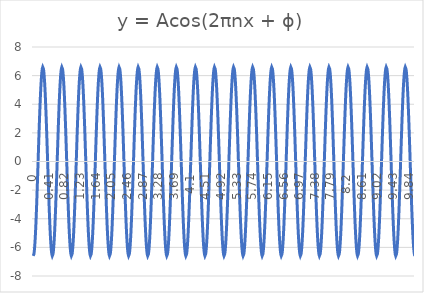
| Category | y = Acos(2πnx + ϕ) |
|---|---|
| 0.0 | -6.594 |
| 0.01 | -6.578 |
| 0.02 | -6.459 |
| 0.03 | -6.238 |
| 0.04 | -5.919 |
| 0.05 | -5.506 |
| 0.060000000000000005 | -5.006 |
| 0.07 | -4.428 |
| 0.08 | -3.779 |
| 0.09 | -3.071 |
| 0.09999999999999999 | -2.315 |
| 0.10999999999999999 | -1.522 |
| 0.11999999999999998 | -0.705 |
| 0.12999999999999998 | 0.123 |
| 0.13999999999999999 | 0.949 |
| 0.15 | 1.76 |
| 0.16 | 2.543 |
| 0.17 | 3.287 |
| 0.18000000000000002 | 3.978 |
| 0.19000000000000003 | 4.607 |
| 0.20000000000000004 | 5.163 |
| 0.21000000000000005 | 5.637 |
| 0.22000000000000006 | 6.023 |
| 0.23000000000000007 | 6.314 |
| 0.24000000000000007 | 6.505 |
| 0.25000000000000006 | 6.594 |
| 0.26000000000000006 | 6.578 |
| 0.2700000000000001 | 6.459 |
| 0.2800000000000001 | 6.238 |
| 0.2900000000000001 | 5.919 |
| 0.3000000000000001 | 5.506 |
| 0.3100000000000001 | 5.006 |
| 0.3200000000000001 | 4.428 |
| 0.3300000000000001 | 3.779 |
| 0.34000000000000014 | 3.071 |
| 0.35000000000000014 | 2.315 |
| 0.36000000000000015 | 1.522 |
| 0.37000000000000016 | 0.705 |
| 0.38000000000000017 | -0.123 |
| 0.3900000000000002 | -0.949 |
| 0.4000000000000002 | -1.76 |
| 0.4100000000000002 | -2.543 |
| 0.4200000000000002 | -3.287 |
| 0.4300000000000002 | -3.978 |
| 0.4400000000000002 | -4.607 |
| 0.45000000000000023 | -5.163 |
| 0.46000000000000024 | -5.637 |
| 0.47000000000000025 | -6.023 |
| 0.48000000000000026 | -6.314 |
| 0.49000000000000027 | -6.505 |
| 0.5000000000000002 | -6.594 |
| 0.5100000000000002 | -6.578 |
| 0.5200000000000002 | -6.459 |
| 0.5300000000000002 | -6.238 |
| 0.5400000000000003 | -5.919 |
| 0.5500000000000003 | -5.506 |
| 0.5600000000000003 | -5.006 |
| 0.5700000000000003 | -4.428 |
| 0.5800000000000003 | -3.779 |
| 0.5900000000000003 | -3.071 |
| 0.6000000000000003 | -2.315 |
| 0.6100000000000003 | -1.522 |
| 0.6200000000000003 | -0.705 |
| 0.6300000000000003 | 0.123 |
| 0.6400000000000003 | 0.949 |
| 0.6500000000000004 | 1.76 |
| 0.6600000000000004 | 2.543 |
| 0.6700000000000004 | 3.287 |
| 0.6800000000000004 | 3.978 |
| 0.6900000000000004 | 4.607 |
| 0.7000000000000004 | 5.163 |
| 0.7100000000000004 | 5.637 |
| 0.7200000000000004 | 6.023 |
| 0.7300000000000004 | 6.314 |
| 0.7400000000000004 | 6.505 |
| 0.7500000000000004 | 6.594 |
| 0.7600000000000005 | 6.578 |
| 0.7700000000000005 | 6.459 |
| 0.7800000000000005 | 6.238 |
| 0.7900000000000005 | 5.919 |
| 0.8000000000000005 | 5.506 |
| 0.8100000000000005 | 5.006 |
| 0.8200000000000005 | 4.428 |
| 0.8300000000000005 | 3.779 |
| 0.8400000000000005 | 3.071 |
| 0.8500000000000005 | 2.315 |
| 0.8600000000000005 | 1.522 |
| 0.8700000000000006 | 0.705 |
| 0.8800000000000006 | -0.123 |
| 0.8900000000000006 | -0.949 |
| 0.9000000000000006 | -1.76 |
| 0.9100000000000006 | -2.543 |
| 0.9200000000000006 | -3.287 |
| 0.9300000000000006 | -3.978 |
| 0.9400000000000006 | -4.607 |
| 0.9500000000000006 | -5.163 |
| 0.9600000000000006 | -5.637 |
| 0.9700000000000006 | -6.023 |
| 0.9800000000000006 | -6.314 |
| 0.9900000000000007 | -6.505 |
| 1.0000000000000007 | -6.594 |
| 1.0100000000000007 | -6.578 |
| 1.0200000000000007 | -6.459 |
| 1.0300000000000007 | -6.238 |
| 1.0400000000000007 | -5.919 |
| 1.0500000000000007 | -5.506 |
| 1.0600000000000007 | -5.006 |
| 1.0700000000000007 | -4.428 |
| 1.0800000000000007 | -3.779 |
| 1.0900000000000007 | -3.071 |
| 1.1000000000000008 | -2.315 |
| 1.1100000000000008 | -1.522 |
| 1.1200000000000008 | -0.705 |
| 1.1300000000000008 | 0.123 |
| 1.1400000000000008 | 0.949 |
| 1.1500000000000008 | 1.76 |
| 1.1600000000000008 | 2.543 |
| 1.1700000000000008 | 3.287 |
| 1.1800000000000008 | 3.978 |
| 1.1900000000000008 | 4.607 |
| 1.2000000000000008 | 5.163 |
| 1.2100000000000009 | 5.637 |
| 1.2200000000000009 | 6.023 |
| 1.2300000000000009 | 6.314 |
| 1.2400000000000009 | 6.505 |
| 1.2500000000000009 | 6.594 |
| 1.260000000000001 | 6.578 |
| 1.270000000000001 | 6.459 |
| 1.280000000000001 | 6.238 |
| 1.290000000000001 | 5.919 |
| 1.300000000000001 | 5.506 |
| 1.310000000000001 | 5.006 |
| 1.320000000000001 | 4.428 |
| 1.330000000000001 | 3.779 |
| 1.340000000000001 | 3.071 |
| 1.350000000000001 | 2.315 |
| 1.360000000000001 | 1.522 |
| 1.370000000000001 | 0.705 |
| 1.380000000000001 | -0.123 |
| 1.390000000000001 | -0.949 |
| 1.400000000000001 | -1.76 |
| 1.410000000000001 | -2.543 |
| 1.420000000000001 | -3.287 |
| 1.430000000000001 | -3.978 |
| 1.440000000000001 | -4.607 |
| 1.450000000000001 | -5.163 |
| 1.460000000000001 | -5.637 |
| 1.470000000000001 | -6.023 |
| 1.480000000000001 | -6.314 |
| 1.490000000000001 | -6.505 |
| 1.500000000000001 | -6.594 |
| 1.5100000000000011 | -6.578 |
| 1.5200000000000011 | -6.459 |
| 1.5300000000000011 | -6.238 |
| 1.5400000000000011 | -5.919 |
| 1.5500000000000012 | -5.506 |
| 1.5600000000000012 | -5.006 |
| 1.5700000000000012 | -4.428 |
| 1.5800000000000012 | -3.779 |
| 1.5900000000000012 | -3.071 |
| 1.6000000000000012 | -2.315 |
| 1.6100000000000012 | -1.522 |
| 1.6200000000000012 | -0.705 |
| 1.6300000000000012 | 0.123 |
| 1.6400000000000012 | 0.949 |
| 1.6500000000000012 | 1.76 |
| 1.6600000000000013 | 2.543 |
| 1.6700000000000013 | 3.287 |
| 1.6800000000000013 | 3.978 |
| 1.6900000000000013 | 4.607 |
| 1.7000000000000013 | 5.163 |
| 1.7100000000000013 | 5.637 |
| 1.7200000000000013 | 6.023 |
| 1.7300000000000013 | 6.314 |
| 1.7400000000000013 | 6.505 |
| 1.7500000000000013 | 6.594 |
| 1.7600000000000013 | 6.578 |
| 1.7700000000000014 | 6.459 |
| 1.7800000000000014 | 6.238 |
| 1.7900000000000014 | 5.919 |
| 1.8000000000000014 | 5.506 |
| 1.8100000000000014 | 5.006 |
| 1.8200000000000014 | 4.428 |
| 1.8300000000000014 | 3.779 |
| 1.8400000000000014 | 3.071 |
| 1.8500000000000014 | 2.315 |
| 1.8600000000000014 | 1.522 |
| 1.8700000000000014 | 0.705 |
| 1.8800000000000014 | -0.123 |
| 1.8900000000000015 | -0.949 |
| 1.9000000000000015 | -1.76 |
| 1.9100000000000015 | -2.543 |
| 1.9200000000000015 | -3.287 |
| 1.9300000000000015 | -3.978 |
| 1.9400000000000015 | -4.607 |
| 1.9500000000000015 | -5.163 |
| 1.9600000000000015 | -5.637 |
| 1.9700000000000015 | -6.023 |
| 1.9800000000000015 | -6.314 |
| 1.9900000000000015 | -6.505 |
| 2.0000000000000013 | -6.594 |
| 2.010000000000001 | -6.578 |
| 2.020000000000001 | -6.459 |
| 2.0300000000000007 | -6.238 |
| 2.0400000000000005 | -5.919 |
| 2.0500000000000003 | -5.506 |
| 2.06 | -5.006 |
| 2.07 | -4.428 |
| 2.0799999999999996 | -3.779 |
| 2.0899999999999994 | -3.071 |
| 2.099999999999999 | -2.315 |
| 2.109999999999999 | -1.522 |
| 2.1199999999999988 | -0.705 |
| 2.1299999999999986 | 0.123 |
| 2.1399999999999983 | 0.949 |
| 2.149999999999998 | 1.76 |
| 2.159999999999998 | 2.543 |
| 2.1699999999999977 | 3.287 |
| 2.1799999999999975 | 3.978 |
| 2.1899999999999973 | 4.607 |
| 2.199999999999997 | 5.163 |
| 2.209999999999997 | 5.637 |
| 2.2199999999999966 | 6.023 |
| 2.2299999999999964 | 6.314 |
| 2.239999999999996 | 6.505 |
| 2.249999999999996 | 6.594 |
| 2.259999999999996 | 6.578 |
| 2.2699999999999956 | 6.459 |
| 2.2799999999999954 | 6.238 |
| 2.289999999999995 | 5.919 |
| 2.299999999999995 | 5.506 |
| 2.3099999999999947 | 5.006 |
| 2.3199999999999945 | 4.428 |
| 2.3299999999999943 | 3.779 |
| 2.339999999999994 | 3.071 |
| 2.349999999999994 | 2.315 |
| 2.3599999999999937 | 1.522 |
| 2.3699999999999934 | 0.705 |
| 2.3799999999999932 | -0.123 |
| 2.389999999999993 | -0.949 |
| 2.399999999999993 | -1.76 |
| 2.4099999999999926 | -2.543 |
| 2.4199999999999924 | -3.287 |
| 2.429999999999992 | -3.978 |
| 2.439999999999992 | -4.607 |
| 2.4499999999999917 | -5.163 |
| 2.4599999999999915 | -5.637 |
| 2.4699999999999913 | -6.023 |
| 2.479999999999991 | -6.314 |
| 2.489999999999991 | -6.505 |
| 2.4999999999999907 | -6.594 |
| 2.5099999999999905 | -6.578 |
| 2.5199999999999902 | -6.459 |
| 2.52999999999999 | -6.238 |
| 2.53999999999999 | -5.919 |
| 2.5499999999999896 | -5.506 |
| 2.5599999999999894 | -5.006 |
| 2.569999999999989 | -4.428 |
| 2.579999999999989 | -3.779 |
| 2.5899999999999888 | -3.071 |
| 2.5999999999999885 | -2.315 |
| 2.6099999999999883 | -1.522 |
| 2.619999999999988 | -0.705 |
| 2.629999999999988 | 0.123 |
| 2.6399999999999877 | 0.949 |
| 2.6499999999999875 | 1.76 |
| 2.6599999999999873 | 2.543 |
| 2.669999999999987 | 3.287 |
| 2.679999999999987 | 3.978 |
| 2.6899999999999866 | 4.607 |
| 2.6999999999999864 | 5.163 |
| 2.709999999999986 | 5.637 |
| 2.719999999999986 | 6.023 |
| 2.7299999999999858 | 6.314 |
| 2.7399999999999856 | 6.505 |
| 2.7499999999999853 | 6.594 |
| 2.759999999999985 | 6.578 |
| 2.769999999999985 | 6.459 |
| 2.7799999999999847 | 6.238 |
| 2.7899999999999845 | 5.919 |
| 2.7999999999999843 | 5.506 |
| 2.809999999999984 | 5.006 |
| 2.819999999999984 | 4.428 |
| 2.8299999999999836 | 3.779 |
| 2.8399999999999834 | 3.071 |
| 2.849999999999983 | 2.315 |
| 2.859999999999983 | 1.522 |
| 2.869999999999983 | 0.705 |
| 2.8799999999999826 | -0.123 |
| 2.8899999999999824 | -0.949 |
| 2.899999999999982 | -1.76 |
| 2.909999999999982 | -2.543 |
| 2.9199999999999817 | -3.287 |
| 2.9299999999999815 | -3.978 |
| 2.9399999999999813 | -4.607 |
| 2.949999999999981 | -5.163 |
| 2.959999999999981 | -5.637 |
| 2.9699999999999807 | -6.023 |
| 2.9799999999999804 | -6.314 |
| 2.9899999999999802 | -6.505 |
| 2.99999999999998 | -6.594 |
| 3.00999999999998 | -6.578 |
| 3.0199999999999796 | -6.459 |
| 3.0299999999999794 | -6.238 |
| 3.039999999999979 | -5.919 |
| 3.049999999999979 | -5.506 |
| 3.0599999999999787 | -5.006 |
| 3.0699999999999785 | -4.428 |
| 3.0799999999999783 | -3.779 |
| 3.089999999999978 | -3.071 |
| 3.099999999999978 | -2.315 |
| 3.1099999999999777 | -1.522 |
| 3.1199999999999775 | -0.705 |
| 3.1299999999999772 | 0.123 |
| 3.139999999999977 | 0.949 |
| 3.149999999999977 | 1.76 |
| 3.1599999999999766 | 2.543 |
| 3.1699999999999764 | 3.287 |
| 3.179999999999976 | 3.978 |
| 3.189999999999976 | 4.607 |
| 3.1999999999999758 | 5.163 |
| 3.2099999999999755 | 5.637 |
| 3.2199999999999753 | 6.023 |
| 3.229999999999975 | 6.314 |
| 3.239999999999975 | 6.505 |
| 3.2499999999999747 | 6.594 |
| 3.2599999999999745 | 6.578 |
| 3.2699999999999743 | 6.459 |
| 3.279999999999974 | 6.238 |
| 3.289999999999974 | 5.919 |
| 3.2999999999999736 | 5.506 |
| 3.3099999999999734 | 5.006 |
| 3.319999999999973 | 4.428 |
| 3.329999999999973 | 3.779 |
| 3.3399999999999728 | 3.071 |
| 3.3499999999999726 | 2.315 |
| 3.3599999999999723 | 1.522 |
| 3.369999999999972 | 0.705 |
| 3.379999999999972 | -0.123 |
| 3.3899999999999717 | -0.949 |
| 3.3999999999999715 | -1.76 |
| 3.4099999999999713 | -2.543 |
| 3.419999999999971 | -3.287 |
| 3.429999999999971 | -3.978 |
| 3.4399999999999706 | -4.607 |
| 3.4499999999999704 | -5.163 |
| 3.45999999999997 | -5.637 |
| 3.46999999999997 | -6.023 |
| 3.47999999999997 | -6.314 |
| 3.4899999999999696 | -6.505 |
| 3.4999999999999694 | -6.594 |
| 3.509999999999969 | -6.578 |
| 3.519999999999969 | -6.459 |
| 3.5299999999999687 | -6.238 |
| 3.5399999999999685 | -5.919 |
| 3.5499999999999683 | -5.506 |
| 3.559999999999968 | -5.006 |
| 3.569999999999968 | -4.428 |
| 3.5799999999999677 | -3.779 |
| 3.5899999999999674 | -3.071 |
| 3.5999999999999672 | -2.315 |
| 3.609999999999967 | -1.522 |
| 3.619999999999967 | -0.705 |
| 3.6299999999999666 | 0.123 |
| 3.6399999999999664 | 0.949 |
| 3.649999999999966 | 1.76 |
| 3.659999999999966 | 2.543 |
| 3.6699999999999657 | 3.287 |
| 3.6799999999999655 | 3.978 |
| 3.6899999999999653 | 4.607 |
| 3.699999999999965 | 5.163 |
| 3.709999999999965 | 5.637 |
| 3.7199999999999647 | 6.023 |
| 3.7299999999999645 | 6.314 |
| 3.7399999999999642 | 6.505 |
| 3.749999999999964 | 6.594 |
| 3.759999999999964 | 6.578 |
| 3.7699999999999636 | 6.459 |
| 3.7799999999999634 | 6.238 |
| 3.789999999999963 | 5.919 |
| 3.799999999999963 | 5.506 |
| 3.8099999999999627 | 5.006 |
| 3.8199999999999625 | 4.428 |
| 3.8299999999999623 | 3.779 |
| 3.839999999999962 | 3.071 |
| 3.849999999999962 | 2.315 |
| 3.8599999999999617 | 1.522 |
| 3.8699999999999615 | 0.705 |
| 3.8799999999999613 | -0.123 |
| 3.889999999999961 | -0.949 |
| 3.899999999999961 | -1.76 |
| 3.9099999999999606 | -2.543 |
| 3.9199999999999604 | -3.287 |
| 3.92999999999996 | -3.978 |
| 3.93999999999996 | -4.607 |
| 3.9499999999999598 | -5.163 |
| 3.9599999999999596 | -5.637 |
| 3.9699999999999593 | -6.023 |
| 3.979999999999959 | -6.314 |
| 3.989999999999959 | -6.505 |
| 3.9999999999999587 | -6.594 |
| 4.009999999999959 | -6.578 |
| 4.019999999999959 | -6.459 |
| 4.0299999999999585 | -6.238 |
| 4.039999999999958 | -5.919 |
| 4.049999999999958 | -5.506 |
| 4.059999999999958 | -5.006 |
| 4.069999999999958 | -4.428 |
| 4.079999999999957 | -3.779 |
| 4.089999999999957 | -3.071 |
| 4.099999999999957 | -2.315 |
| 4.109999999999957 | -1.522 |
| 4.119999999999957 | -0.705 |
| 4.129999999999956 | 0.123 |
| 4.139999999999956 | 0.949 |
| 4.149999999999956 | 1.76 |
| 4.159999999999956 | 2.543 |
| 4.1699999999999555 | 3.287 |
| 4.179999999999955 | 3.978 |
| 4.189999999999955 | 4.607 |
| 4.199999999999955 | 5.163 |
| 4.209999999999955 | 5.637 |
| 4.2199999999999545 | 6.023 |
| 4.229999999999954 | 6.314 |
| 4.239999999999954 | 6.505 |
| 4.249999999999954 | 6.594 |
| 4.259999999999954 | 6.578 |
| 4.269999999999953 | 6.459 |
| 4.279999999999953 | 6.238 |
| 4.289999999999953 | 5.919 |
| 4.299999999999953 | 5.506 |
| 4.3099999999999525 | 5.006 |
| 4.319999999999952 | 4.428 |
| 4.329999999999952 | 3.779 |
| 4.339999999999952 | 3.071 |
| 4.349999999999952 | 2.315 |
| 4.3599999999999515 | 1.522 |
| 4.369999999999951 | 0.705 |
| 4.379999999999951 | -0.123 |
| 4.389999999999951 | -0.949 |
| 4.399999999999951 | -1.76 |
| 4.40999999999995 | -2.543 |
| 4.41999999999995 | -3.287 |
| 4.42999999999995 | -3.978 |
| 4.43999999999995 | -4.607 |
| 4.4499999999999496 | -5.163 |
| 4.459999999999949 | -5.637 |
| 4.469999999999949 | -6.023 |
| 4.479999999999949 | -6.314 |
| 4.489999999999949 | -6.505 |
| 4.4999999999999485 | -6.594 |
| 4.509999999999948 | -6.578 |
| 4.519999999999948 | -6.459 |
| 4.529999999999948 | -6.238 |
| 4.539999999999948 | -5.919 |
| 4.549999999999947 | -5.506 |
| 4.559999999999947 | -5.006 |
| 4.569999999999947 | -4.428 |
| 4.579999999999947 | -3.779 |
| 4.589999999999947 | -3.071 |
| 4.599999999999946 | -2.315 |
| 4.609999999999946 | -1.522 |
| 4.619999999999946 | -0.705 |
| 4.629999999999946 | 0.123 |
| 4.6399999999999455 | 0.949 |
| 4.649999999999945 | 1.76 |
| 4.659999999999945 | 2.543 |
| 4.669999999999945 | 3.287 |
| 4.679999999999945 | 3.978 |
| 4.689999999999944 | 4.607 |
| 4.699999999999944 | 5.163 |
| 4.709999999999944 | 5.637 |
| 4.719999999999944 | 6.023 |
| 4.729999999999944 | 6.314 |
| 4.739999999999943 | 6.505 |
| 4.749999999999943 | 6.594 |
| 4.759999999999943 | 6.578 |
| 4.769999999999943 | 6.459 |
| 4.7799999999999425 | 6.238 |
| 4.789999999999942 | 5.919 |
| 4.799999999999942 | 5.506 |
| 4.809999999999942 | 5.006 |
| 4.819999999999942 | 4.428 |
| 4.8299999999999415 | 3.779 |
| 4.839999999999941 | 3.071 |
| 4.849999999999941 | 2.315 |
| 4.859999999999941 | 1.522 |
| 4.869999999999941 | 0.705 |
| 4.87999999999994 | -0.123 |
| 4.88999999999994 | -0.949 |
| 4.89999999999994 | -1.76 |
| 4.90999999999994 | -2.543 |
| 4.9199999999999395 | -3.287 |
| 4.929999999999939 | -3.978 |
| 4.939999999999939 | -4.607 |
| 4.949999999999939 | -5.163 |
| 4.959999999999939 | -5.637 |
| 4.9699999999999385 | -6.023 |
| 4.979999999999938 | -6.314 |
| 4.989999999999938 | -6.505 |
| 4.999999999999938 | -6.594 |
| 5.009999999999938 | -6.578 |
| 5.019999999999937 | -6.459 |
| 5.029999999999937 | -6.238 |
| 5.039999999999937 | -5.919 |
| 5.049999999999937 | -5.506 |
| 5.0599999999999365 | -5.006 |
| 5.069999999999936 | -4.428 |
| 5.079999999999936 | -3.779 |
| 5.089999999999936 | -3.071 |
| 5.099999999999936 | -2.315 |
| 5.1099999999999355 | -1.522 |
| 5.119999999999935 | -0.705 |
| 5.129999999999935 | 0.123 |
| 5.139999999999935 | 0.949 |
| 5.149999999999935 | 1.76 |
| 5.159999999999934 | 2.543 |
| 5.169999999999934 | 3.287 |
| 5.179999999999934 | 3.978 |
| 5.189999999999934 | 4.607 |
| 5.199999999999934 | 5.163 |
| 5.209999999999933 | 5.637 |
| 5.219999999999933 | 6.023 |
| 5.229999999999933 | 6.314 |
| 5.239999999999933 | 6.505 |
| 5.2499999999999325 | 6.594 |
| 5.259999999999932 | 6.578 |
| 5.269999999999932 | 6.459 |
| 5.279999999999932 | 6.238 |
| 5.289999999999932 | 5.919 |
| 5.299999999999931 | 5.506 |
| 5.309999999999931 | 5.006 |
| 5.319999999999931 | 4.428 |
| 5.329999999999931 | 3.779 |
| 5.339999999999931 | 3.071 |
| 5.34999999999993 | 2.315 |
| 5.35999999999993 | 1.522 |
| 5.36999999999993 | 0.705 |
| 5.37999999999993 | -0.123 |
| 5.3899999999999295 | -0.949 |
| 5.399999999999929 | -1.76 |
| 5.409999999999929 | -2.543 |
| 5.419999999999929 | -3.287 |
| 5.429999999999929 | -3.978 |
| 5.4399999999999284 | -4.607 |
| 5.449999999999928 | -5.163 |
| 5.459999999999928 | -5.637 |
| 5.469999999999928 | -6.023 |
| 5.479999999999928 | -6.314 |
| 5.489999999999927 | -6.505 |
| 5.499999999999927 | -6.594 |
| 5.509999999999927 | -6.578 |
| 5.519999999999927 | -6.459 |
| 5.5299999999999265 | -6.238 |
| 5.539999999999926 | -5.919 |
| 5.549999999999926 | -5.506 |
| 5.559999999999926 | -5.006 |
| 5.569999999999926 | -4.428 |
| 5.5799999999999255 | -3.779 |
| 5.589999999999925 | -3.071 |
| 5.599999999999925 | -2.315 |
| 5.609999999999925 | -1.522 |
| 5.619999999999925 | -0.705 |
| 5.629999999999924 | 0.123 |
| 5.639999999999924 | 0.949 |
| 5.649999999999924 | 1.76 |
| 5.659999999999924 | 2.543 |
| 5.6699999999999235 | 3.287 |
| 5.679999999999923 | 3.978 |
| 5.689999999999923 | 4.607 |
| 5.699999999999923 | 5.163 |
| 5.709999999999923 | 5.637 |
| 5.7199999999999225 | 6.023 |
| 5.729999999999922 | 6.314 |
| 5.739999999999922 | 6.505 |
| 5.749999999999922 | 6.594 |
| 5.759999999999922 | 6.578 |
| 5.769999999999921 | 6.459 |
| 5.779999999999921 | 6.238 |
| 5.789999999999921 | 5.919 |
| 5.799999999999921 | 5.506 |
| 5.809999999999921 | 5.006 |
| 5.81999999999992 | 4.428 |
| 5.82999999999992 | 3.779 |
| 5.83999999999992 | 3.071 |
| 5.84999999999992 | 2.315 |
| 5.8599999999999195 | 1.522 |
| 5.869999999999919 | 0.705 |
| 5.879999999999919 | -0.123 |
| 5.889999999999919 | -0.949 |
| 5.899999999999919 | -1.76 |
| 5.909999999999918 | -2.543 |
| 5.919999999999918 | -3.287 |
| 5.929999999999918 | -3.978 |
| 5.939999999999918 | -4.607 |
| 5.949999999999918 | -5.163 |
| 5.959999999999917 | -5.637 |
| 5.969999999999917 | -6.023 |
| 5.979999999999917 | -6.314 |
| 5.989999999999917 | -6.505 |
| 5.9999999999999165 | -6.594 |
| 6.009999999999916 | -6.578 |
| 6.019999999999916 | -6.459 |
| 6.029999999999916 | -6.238 |
| 6.039999999999916 | -5.919 |
| 6.0499999999999154 | -5.506 |
| 6.059999999999915 | -5.006 |
| 6.069999999999915 | -4.428 |
| 6.079999999999915 | -3.779 |
| 6.089999999999915 | -3.071 |
| 6.099999999999914 | -2.315 |
| 6.109999999999914 | -1.522 |
| 6.119999999999914 | -0.705 |
| 6.129999999999914 | 0.123 |
| 6.1399999999999135 | 0.949 |
| 6.149999999999913 | 1.76 |
| 6.159999999999913 | 2.543 |
| 6.169999999999913 | 3.287 |
| 6.179999999999913 | 3.978 |
| 6.1899999999999125 | 4.607 |
| 6.199999999999912 | 5.163 |
| 6.209999999999912 | 5.637 |
| 6.219999999999912 | 6.023 |
| 6.229999999999912 | 6.314 |
| 6.239999999999911 | 6.505 |
| 6.249999999999911 | 6.594 |
| 6.259999999999911 | 6.578 |
| 6.269999999999911 | 6.459 |
| 6.2799999999999105 | 6.238 |
| 6.28999999999991 | 5.919 |
| 6.29999999999991 | 5.506 |
| 6.30999999999991 | 5.006 |
| 6.31999999999991 | 4.428 |
| 6.3299999999999095 | 3.779 |
| 6.339999999999909 | 3.071 |
| 6.349999999999909 | 2.315 |
| 6.359999999999909 | 1.522 |
| 6.369999999999909 | 0.705 |
| 6.379999999999908 | -0.123 |
| 6.389999999999908 | -0.949 |
| 6.399999999999908 | -1.76 |
| 6.409999999999908 | -2.543 |
| 6.419999999999908 | -3.287 |
| 6.429999999999907 | -3.978 |
| 6.439999999999907 | -4.607 |
| 6.449999999999907 | -5.163 |
| 6.459999999999907 | -5.637 |
| 6.4699999999999065 | -6.023 |
| 6.479999999999906 | -6.314 |
| 6.489999999999906 | -6.505 |
| 6.499999999999906 | -6.594 |
| 6.509999999999906 | -6.578 |
| 6.519999999999905 | -6.459 |
| 6.529999999999905 | -6.238 |
| 6.539999999999905 | -5.919 |
| 6.549999999999905 | -5.506 |
| 6.559999999999905 | -5.006 |
| 6.569999999999904 | -4.428 |
| 6.579999999999904 | -3.779 |
| 6.589999999999904 | -3.071 |
| 6.599999999999904 | -2.315 |
| 6.6099999999999035 | -1.522 |
| 6.619999999999903 | -0.705 |
| 6.629999999999903 | 0.123 |
| 6.639999999999903 | 0.949 |
| 6.649999999999903 | 1.76 |
| 6.659999999999902 | 2.543 |
| 6.669999999999902 | 3.287 |
| 6.679999999999902 | 3.978 |
| 6.689999999999902 | 4.607 |
| 6.699999999999902 | 5.163 |
| 6.709999999999901 | 5.637 |
| 6.719999999999901 | 6.023 |
| 6.729999999999901 | 6.314 |
| 6.739999999999901 | 6.505 |
| 6.7499999999999005 | 6.594 |
| 6.7599999999999 | 6.578 |
| 6.7699999999999 | 6.459 |
| 6.7799999999999 | 6.238 |
| 6.7899999999999 | 5.919 |
| 6.7999999999998995 | 5.506 |
| 6.809999999999899 | 5.006 |
| 6.819999999999899 | 4.428 |
| 6.829999999999899 | 3.779 |
| 6.839999999999899 | 3.071 |
| 6.849999999999898 | 2.315 |
| 6.859999999999898 | 1.522 |
| 6.869999999999898 | 0.705 |
| 6.879999999999898 | -0.123 |
| 6.8899999999998975 | -0.949 |
| 6.899999999999897 | -1.76 |
| 6.909999999999897 | -2.543 |
| 6.919999999999897 | -3.287 |
| 6.929999999999897 | -3.978 |
| 6.9399999999998965 | -4.607 |
| 6.949999999999896 | -5.163 |
| 6.959999999999896 | -5.637 |
| 6.969999999999896 | -6.023 |
| 6.979999999999896 | -6.314 |
| 6.989999999999895 | -6.505 |
| 6.999999999999895 | -6.594 |
| 7.009999999999895 | -6.578 |
| 7.019999999999895 | -6.459 |
| 7.0299999999998946 | -6.238 |
| 7.039999999999894 | -5.919 |
| 7.049999999999894 | -5.506 |
| 7.059999999999894 | -5.006 |
| 7.069999999999894 | -4.428 |
| 7.0799999999998935 | -3.779 |
| 7.089999999999893 | -3.071 |
| 7.099999999999893 | -2.315 |
| 7.109999999999893 | -1.522 |
| 7.119999999999893 | -0.705 |
| 7.129999999999892 | 0.123 |
| 7.139999999999892 | 0.949 |
| 7.149999999999892 | 1.76 |
| 7.159999999999892 | 2.543 |
| 7.169999999999892 | 3.287 |
| 7.179999999999891 | 3.978 |
| 7.189999999999891 | 4.607 |
| 7.199999999999891 | 5.163 |
| 7.209999999999891 | 5.637 |
| 7.2199999999998905 | 6.023 |
| 7.22999999999989 | 6.314 |
| 7.23999999999989 | 6.505 |
| 7.24999999999989 | 6.594 |
| 7.25999999999989 | 6.578 |
| 7.269999999999889 | 6.459 |
| 7.279999999999889 | 6.238 |
| 7.289999999999889 | 5.919 |
| 7.299999999999889 | 5.506 |
| 7.309999999999889 | 5.006 |
| 7.319999999999888 | 4.428 |
| 7.329999999999888 | 3.779 |
| 7.339999999999888 | 3.071 |
| 7.349999999999888 | 2.315 |
| 7.3599999999998875 | 1.522 |
| 7.369999999999887 | 0.705 |
| 7.379999999999887 | -0.123 |
| 7.389999999999887 | -0.949 |
| 7.399999999999887 | -1.76 |
| 7.4099999999998865 | -2.543 |
| 7.419999999999886 | -3.287 |
| 7.429999999999886 | -3.978 |
| 7.439999999999886 | -4.607 |
| 7.449999999999886 | -5.163 |
| 7.459999999999885 | -5.637 |
| 7.469999999999885 | -6.023 |
| 7.479999999999885 | -6.314 |
| 7.489999999999885 | -6.505 |
| 7.4999999999998845 | -6.594 |
| 7.509999999999884 | -6.578 |
| 7.519999999999884 | -6.459 |
| 7.529999999999884 | -6.238 |
| 7.539999999999884 | -5.919 |
| 7.5499999999998835 | -5.506 |
| 7.559999999999883 | -5.006 |
| 7.569999999999883 | -4.428 |
| 7.579999999999883 | -3.779 |
| 7.589999999999883 | -3.071 |
| 7.599999999999882 | -2.315 |
| 7.609999999999882 | -1.522 |
| 7.619999999999882 | -0.705 |
| 7.629999999999882 | 0.123 |
| 7.6399999999998816 | 0.949 |
| 7.649999999999881 | 1.76 |
| 7.659999999999881 | 2.543 |
| 7.669999999999881 | 3.287 |
| 7.679999999999881 | 3.978 |
| 7.6899999999998805 | 4.607 |
| 7.69999999999988 | 5.163 |
| 7.70999999999988 | 5.637 |
| 7.71999999999988 | 6.023 |
| 7.72999999999988 | 6.314 |
| 7.739999999999879 | 6.505 |
| 7.749999999999879 | 6.594 |
| 7.759999999999879 | 6.578 |
| 7.769999999999879 | 6.459 |
| 7.779999999999879 | 6.238 |
| 7.789999999999878 | 5.919 |
| 7.799999999999878 | 5.506 |
| 7.809999999999878 | 5.006 |
| 7.819999999999878 | 4.428 |
| 7.8299999999998775 | 3.779 |
| 7.839999999999877 | 3.071 |
| 7.849999999999877 | 2.315 |
| 7.859999999999877 | 1.522 |
| 7.869999999999877 | 0.705 |
| 7.879999999999876 | -0.123 |
| 7.889999999999876 | -0.949 |
| 7.899999999999876 | -1.76 |
| 7.909999999999876 | -2.543 |
| 7.919999999999876 | -3.287 |
| 7.929999999999875 | -3.978 |
| 7.939999999999875 | -4.607 |
| 7.949999999999875 | -5.163 |
| 7.959999999999875 | -5.637 |
| 7.9699999999998745 | -6.023 |
| 7.979999999999874 | -6.314 |
| 7.989999999999874 | -6.505 |
| 7.999999999999874 | -6.594 |
| 8.009999999999874 | -6.578 |
| 8.019999999999873 | -6.459 |
| 8.029999999999873 | -6.238 |
| 8.039999999999873 | -5.919 |
| 8.049999999999873 | -5.506 |
| 8.059999999999873 | -5.006 |
| 8.069999999999872 | -4.428 |
| 8.079999999999872 | -3.779 |
| 8.089999999999872 | -3.071 |
| 8.099999999999872 | -2.315 |
| 8.109999999999872 | -1.522 |
| 8.119999999999871 | -0.705 |
| 8.129999999999871 | 0.123 |
| 8.139999999999871 | 0.949 |
| 8.14999999999987 | 1.76 |
| 8.15999999999987 | 2.543 |
| 8.16999999999987 | 3.287 |
| 8.17999999999987 | 3.978 |
| 8.18999999999987 | 4.607 |
| 8.19999999999987 | 5.163 |
| 8.20999999999987 | 5.637 |
| 8.21999999999987 | 6.023 |
| 8.229999999999869 | 6.314 |
| 8.239999999999869 | 6.505 |
| 8.249999999999869 | 6.594 |
| 8.259999999999868 | 6.578 |
| 8.269999999999868 | 6.459 |
| 8.279999999999868 | 6.238 |
| 8.289999999999868 | 5.919 |
| 8.299999999999867 | 5.506 |
| 8.309999999999867 | 5.006 |
| 8.319999999999867 | 4.428 |
| 8.329999999999867 | 3.779 |
| 8.339999999999867 | 3.071 |
| 8.349999999999866 | 2.315 |
| 8.359999999999866 | 1.522 |
| 8.369999999999866 | 0.705 |
| 8.379999999999866 | -0.123 |
| 8.389999999999866 | -0.949 |
| 8.399999999999865 | -1.76 |
| 8.409999999999865 | -2.543 |
| 8.419999999999865 | -3.287 |
| 8.429999999999865 | -3.978 |
| 8.439999999999864 | -4.607 |
| 8.449999999999864 | -5.163 |
| 8.459999999999864 | -5.637 |
| 8.469999999999864 | -6.023 |
| 8.479999999999864 | -6.314 |
| 8.489999999999863 | -6.505 |
| 8.499999999999863 | -6.594 |
| 8.509999999999863 | -6.578 |
| 8.519999999999863 | -6.459 |
| 8.529999999999863 | -6.238 |
| 8.539999999999862 | -5.919 |
| 8.549999999999862 | -5.506 |
| 8.559999999999862 | -5.006 |
| 8.569999999999862 | -4.428 |
| 8.579999999999862 | -3.779 |
| 8.589999999999861 | -3.071 |
| 8.599999999999861 | -2.315 |
| 8.60999999999986 | -1.522 |
| 8.61999999999986 | -0.705 |
| 8.62999999999986 | 0.123 |
| 8.63999999999986 | 0.949 |
| 8.64999999999986 | 1.76 |
| 8.65999999999986 | 2.543 |
| 8.66999999999986 | 3.287 |
| 8.67999999999986 | 3.978 |
| 8.68999999999986 | 4.607 |
| 8.699999999999859 | 5.163 |
| 8.709999999999859 | 5.637 |
| 8.719999999999859 | 6.023 |
| 8.729999999999858 | 6.314 |
| 8.739999999999858 | 6.505 |
| 8.749999999999858 | 6.594 |
| 8.759999999999858 | 6.578 |
| 8.769999999999857 | 6.459 |
| 8.779999999999857 | 6.238 |
| 8.789999999999857 | 5.919 |
| 8.799999999999857 | 5.506 |
| 8.809999999999857 | 5.006 |
| 8.819999999999856 | 4.428 |
| 8.829999999999856 | 3.779 |
| 8.839999999999856 | 3.071 |
| 8.849999999999856 | 2.315 |
| 8.859999999999856 | 1.522 |
| 8.869999999999855 | 0.705 |
| 8.879999999999855 | -0.123 |
| 8.889999999999855 | -0.949 |
| 8.899999999999855 | -1.76 |
| 8.909999999999854 | -2.543 |
| 8.919999999999854 | -3.287 |
| 8.929999999999854 | -3.978 |
| 8.939999999999854 | -4.607 |
| 8.949999999999854 | -5.163 |
| 8.959999999999853 | -5.637 |
| 8.969999999999853 | -6.023 |
| 8.979999999999853 | -6.314 |
| 8.989999999999853 | -6.505 |
| 8.999999999999853 | -6.594 |
| 9.009999999999852 | -6.578 |
| 9.019999999999852 | -6.459 |
| 9.029999999999852 | -6.238 |
| 9.039999999999852 | -5.919 |
| 9.049999999999851 | -5.506 |
| 9.059999999999851 | -5.006 |
| 9.069999999999851 | -4.428 |
| 9.07999999999985 | -3.779 |
| 9.08999999999985 | -3.071 |
| 9.09999999999985 | -2.315 |
| 9.10999999999985 | -1.522 |
| 9.11999999999985 | -0.705 |
| 9.12999999999985 | 0.123 |
| 9.13999999999985 | 0.949 |
| 9.14999999999985 | 1.76 |
| 9.15999999999985 | 2.543 |
| 9.169999999999849 | 3.287 |
| 9.179999999999849 | 3.978 |
| 9.189999999999849 | 4.607 |
| 9.199999999999848 | 5.163 |
| 9.209999999999848 | 5.637 |
| 9.219999999999848 | 6.023 |
| 9.229999999999848 | 6.314 |
| 9.239999999999847 | 6.505 |
| 9.249999999999847 | 6.594 |
| 9.259999999999847 | 6.578 |
| 9.269999999999847 | 6.459 |
| 9.279999999999847 | 6.238 |
| 9.289999999999846 | 5.919 |
| 9.299999999999846 | 5.506 |
| 9.309999999999846 | 5.006 |
| 9.319999999999846 | 4.428 |
| 9.329999999999846 | 3.779 |
| 9.339999999999845 | 3.071 |
| 9.349999999999845 | 2.315 |
| 9.359999999999845 | 1.522 |
| 9.369999999999845 | 0.705 |
| 9.379999999999844 | -0.123 |
| 9.389999999999844 | -0.949 |
| 9.399999999999844 | -1.76 |
| 9.409999999999844 | -2.543 |
| 9.419999999999844 | -3.287 |
| 9.429999999999843 | -3.978 |
| 9.439999999999843 | -4.607 |
| 9.449999999999843 | -5.163 |
| 9.459999999999843 | -5.637 |
| 9.469999999999843 | -6.023 |
| 9.479999999999842 | -6.314 |
| 9.489999999999842 | -6.505 |
| 9.499999999999842 | -6.594 |
| 9.509999999999842 | -6.578 |
| 9.519999999999841 | -6.459 |
| 9.529999999999841 | -6.238 |
| 9.539999999999841 | -5.919 |
| 9.54999999999984 | -5.506 |
| 9.55999999999984 | -5.006 |
| 9.56999999999984 | -4.428 |
| 9.57999999999984 | -3.779 |
| 9.58999999999984 | -3.071 |
| 9.59999999999984 | -2.315 |
| 9.60999999999984 | -1.522 |
| 9.61999999999984 | -0.705 |
| 9.62999999999984 | 0.123 |
| 9.639999999999839 | 0.949 |
| 9.649999999999839 | 1.76 |
| 9.659999999999838 | 2.543 |
| 9.669999999999838 | 3.287 |
| 9.679999999999838 | 3.978 |
| 9.689999999999838 | 4.607 |
| 9.699999999999838 | 5.163 |
| 9.709999999999837 | 5.637 |
| 9.719999999999837 | 6.023 |
| 9.729999999999837 | 6.314 |
| 9.739999999999837 | 6.505 |
| 9.749999999999837 | 6.594 |
| 9.759999999999836 | 6.578 |
| 9.769999999999836 | 6.459 |
| 9.779999999999836 | 6.238 |
| 9.789999999999836 | 5.919 |
| 9.799999999999836 | 5.506 |
| 9.809999999999835 | 5.006 |
| 9.819999999999835 | 4.428 |
| 9.829999999999835 | 3.779 |
| 9.839999999999835 | 3.071 |
| 9.849999999999834 | 2.315 |
| 9.859999999999834 | 1.522 |
| 9.869999999999834 | 0.705 |
| 9.879999999999834 | -0.123 |
| 9.889999999999834 | -0.949 |
| 9.899999999999833 | -1.76 |
| 9.909999999999833 | -2.543 |
| 9.919999999999833 | -3.287 |
| 9.929999999999833 | -3.978 |
| 9.939999999999833 | -4.607 |
| 9.949999999999832 | -5.163 |
| 9.959999999999832 | -5.637 |
| 9.969999999999832 | -6.023 |
| 9.979999999999832 | -6.314 |
| 9.989999999999831 | -6.505 |
| 9.999999999999831 | -6.594 |